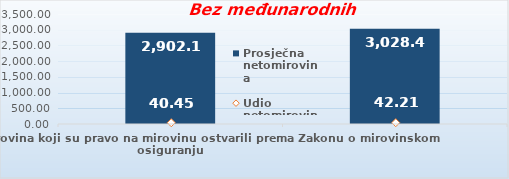
| Category | Prosječna netomirovina  |
|---|---|
| Korisnici mirovina koji su pravo na mirovinu ostvarili prema Zakonu o mirovinskom osiguranju  | 2902.13 |
| Korisnici koji su pravo na mirovinu PRVI PUT ostvarili u 2021. godini prema Zakonu o mirovinskom osiguranju - NOVI KORISNICI | 3028.487 |